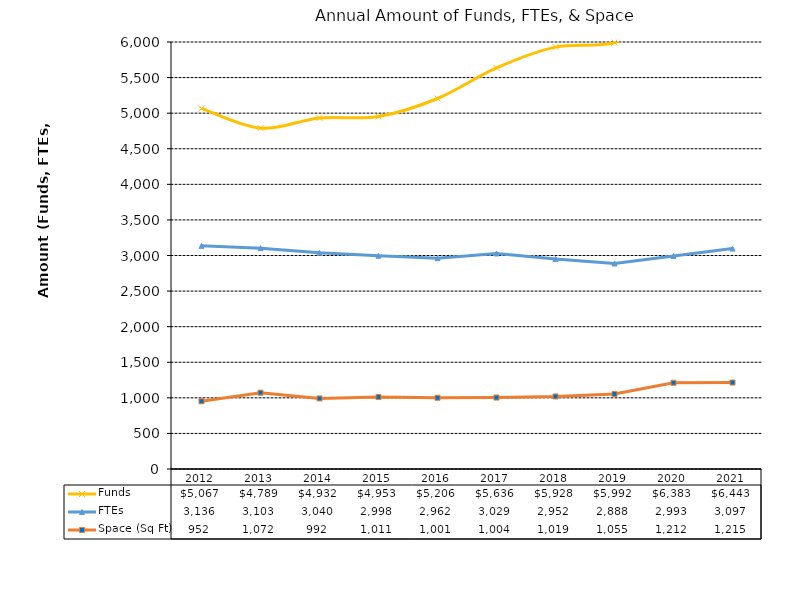
| Category | Funds | FTEs | Space (Sq Ft) |
|---|---|---|---|
| 2012.0 | 5067.342 | 3136 | 951.592 |
| 2013.0 | 4789.014 | 3103 | 1072.41 |
| 2014.0 | 4932.368 | 3040 | 991.644 |
| 2015.0 | 4952.593 | 2998 | 1010.876 |
| 2016.0 | 5206.174 | 2962 | 1000.815 |
| 2017.0 | 5636.393 | 3029 | 1003.896 |
| 2018.0 | 5928 | 2952 | 1019.284 |
| 2019.0 | 5992 | 2888 | 1054.501 |
| 2020.0 | 6383 | 2993 | 1211.944 |
| 2021.0 | 6443 | 3097 | 1215 |